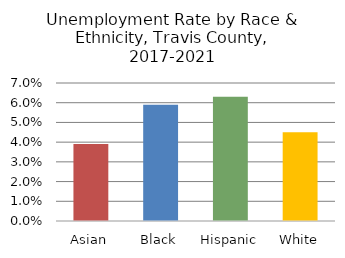
| Category | Series 0 |
|---|---|
| Asian | 0.039 |
| Black | 0.059 |
| Hispanic | 0.063 |
| White | 0.045 |